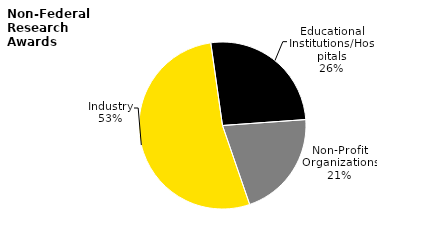
| Category | Series 0 |
|---|---|
| Industry | 105.398 |
| Educational Institutions/Hospitals | 51.899 |
| Non-Profit Organizations | 41.45 |